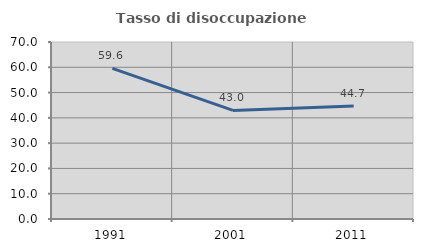
| Category | Tasso di disoccupazione giovanile  |
|---|---|
| 1991.0 | 59.567 |
| 2001.0 | 42.952 |
| 2011.0 | 44.695 |